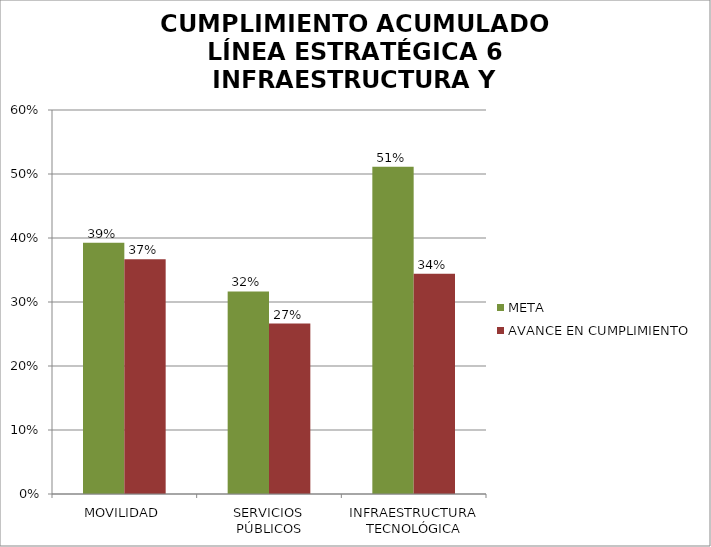
| Category | META | AVANCE EN CUMPLIMIENTO |
|---|---|---|
| MOVILIDAD | 0.392 | 0.367 |
| SERVICIOS PÚBLICOS | 0.316 | 0.266 |
| INFRAESTRUCTURA TECNOLÓGICA | 0.511 | 0.344 |